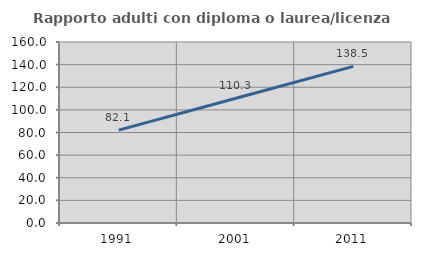
| Category | Rapporto adulti con diploma o laurea/licenza media  |
|---|---|
| 1991.0 | 82.143 |
| 2001.0 | 110.262 |
| 2011.0 | 138.479 |